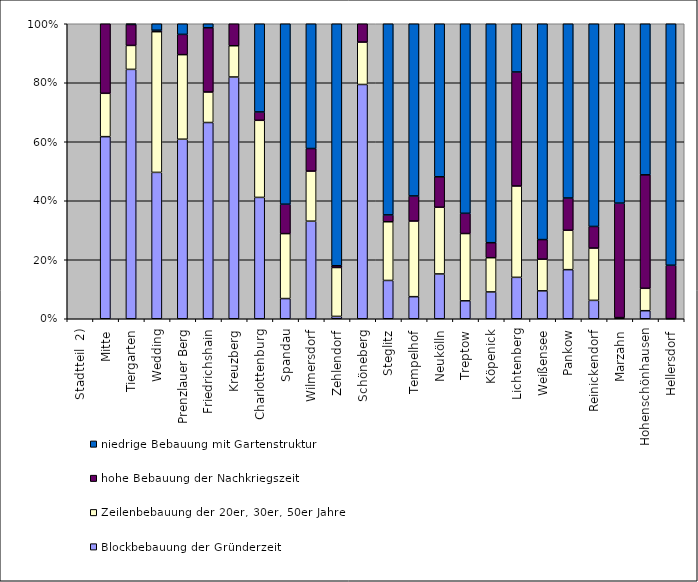
| Category | Blockbebauung der Gründerzeit | Zeilenbebauung der 20er und 30er Jahre  | Zeilenbebauung der 20er, 30er, 50er Jahre  | hohe Bebauung der Nachkriegszeit | Series 5 | Series 7 | niedrige Bebauung mit Gartenstruktur  |
|---|---|---|---|---|---|---|---|
| Stadtteil  2) | 0 |  | 0 | 0 |  |  | 0 |
| Mitte | 172.672 |  | 41.104 | 65.954 |  |  | 0 |
| Tiergarten | 241.09 |  | 23.142 | 20.27 |  |  | 0.691 |
| Wedding | 270.043 |  | 259.556 | 2.679 |  |  | 11.987 |
| Prenzlauer Berg | 253.803 |  | 119.545 | 28.637 |  |  | 15.041 |
| Friedrichshain | 198.132 |  | 30.811 | 64.786 |  |  | 4.108 |
| Kreuzberg | 335.046 |  | 43.293 | 30.499 |  |  | 0 |
| Charlottenburg | 334.229 |  | 212.31 | 23.039 |  |  | 242.893 |
| Spandau | 144.434 |  | 464.565 | 210.393 |  |  | 1290.872 |
| Wilmersdorf | 262.137 |  | 134.513 | 60.634 |  |  | 335.111 |
| Zehlendorf | 13.002 |  | 270.981 | 9.828 |  |  | 1341.143 |
| Schöneberg | 351.536 |  | 63.616 | 27.519 |  |  | 0 |
| Steglitz | 208.152 |  | 318.958 | 37.199 |  |  | 1038.815 |
| Tempelhof | 120.432 |  | 412.499 | 136.719 |  |  | 939.162 |
| Neukölln | 296.651 |  | 441.485 | 201.468 |  |  | 1012.971 |
| Treptow | 78.558 |  | 294.486 | 88.534 |  |  | 829.816 |
| Köpenick | 154.776 |  | 197.235 | 86.546 |  |  | 1262.454 |
| Lichtenberg | 99.107 |  | 218.629 | 272.779 |  |  | 115.437 |
| Weißensee | 90.876 |  | 103.162 | 63.737 |  |  | 702.778 |
| Pankow | 202.283 |  | 162.27 | 132.771 |  |  | 717.954 |
| Reinickendorf | 169.229 |  | 481.762 | 199 |  |  | 1866.719 |
| Marzahn | 0 |  | 3.971 | 394.476 |  |  | 618.187 |
| Hohenschönhausen | 17.12 |  | 47.566 | 241.205 |  |  | 321.036 |
| Hellersdorf | 0 |  | 0.522 | 279.505 |  |  | 1263.693 |